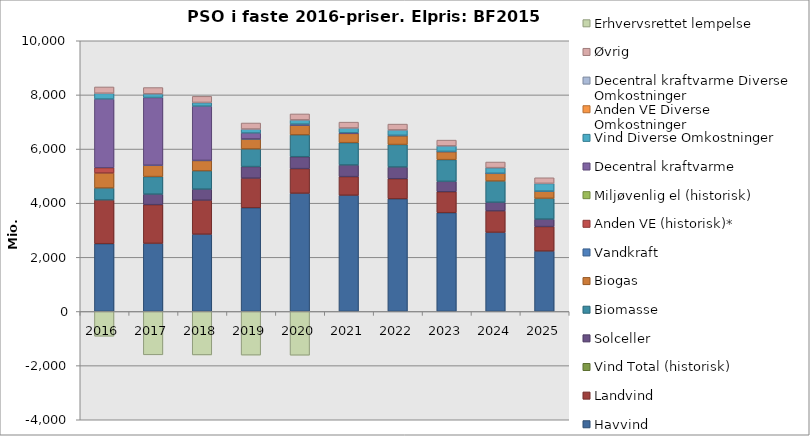
| Category | Havvind | Landvind | Vind Total (historisk) | Solceller | Biomasse | Biogas | Vandkraft | Anden VE (historisk)* | Miljøvenlig el (historisk) | Decentral kraftvarme | Vind Diverse Omkostninger | Anden VE Diverse Omkostninger | Decentral kraftvarme Diverse Omkostninger | Øvrig | Erhvervsrettet lempelse |
|---|---|---|---|---|---|---|---|---|---|---|---|---|---|---|---|
| 2016 | 2503.6 | 1615.534 | 0 | 0 | 442.278 | 552.308 | 0 | 195.5 | 0 | 2539.565 | 208.025 | 0 | 6.18 | 231.18 | -915.921 |
| 2017 | 2516.913 | 1428.856 | 0 | 388.036 | 648.496 | 417.441 | 3.251 | 0 | 0 | 2500.336 | 132.453 | 0 | 6.913 | 229.085 | -1602.039 |
| 2018 | 2855.46 | 1255.469 | 0 | 407.363 | 675.588 | 384.792 | 2.988 | 0 | 0 | 2003.892 | 129.721 | 0 | 6.775 | 225.301 | -1604.96 |
| 2019 | 3830.253 | 1094.071 | 0 | 428.082 | 651.493 | 369.556 | 2.831 | 0 | 0 | 217.214 | 139.461 | 0 | 6.659 | 222.225 | -1612.378 |
| 2020 | 4367.777 | 908.105 | 0 | 440.84 | 807.517 | 357.134 | 2.674 | 0 | 0 | 38.429 | 149.09 | 0 | 6.533 | 218.792 | -1616.669 |
| 2021 | 4294.379 | 686.818 | 0 | 429.274 | 825.009 | 343.532 | 2.42 | 0 | 0 | 20.738 | 169.726 | 0 | 6.427 | 216.038 | 0 |
| 2022 | 4161.564 | 741.698 | 0 | 432.885 | 830.664 | 329.074 | 2.252 | 0 | 0 | 9.741 | 194.007 | 0 | 6.323 | 213.301 | 0 |
| 2023 | 3648.116 | 774.121 | 0 | 385.226 | 800.371 | 301.191 | 2.114 | 0 | 0 | 1.846 | 200.254 | 0 | 6.22 | 210.587 | 0 |
| 2024 | 2924.558 | 790.553 | 0 | 319.574 | 784.292 | 284.112 | 2.017 | 0 | 0 | 0.438 | 201.304 | 0 | 6.12 | 207.963 | 0 |
| 2025 | 2232.915 | 903.264 | 0 | 275.787 | 767.26 | 265.376 | 1.898 | 0 | 0 | 0 | 281.063 | 0 | 6.022 | 205.398 | 0 |